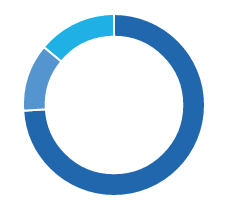
| Category | Series 0 |
|---|---|
| ● Voted with management | 0.74 |
| ● Voted against management | 0.12 |
| ● No votes cast | 0.14 |